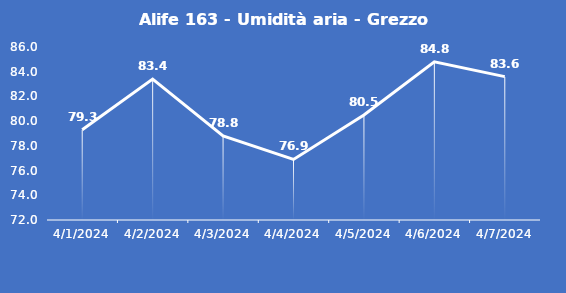
| Category | Alife 163 - Umidità aria - Grezzo (%) |
|---|---|
| 4/1/24 | 79.3 |
| 4/2/24 | 83.4 |
| 4/3/24 | 78.8 |
| 4/4/24 | 76.9 |
| 4/5/24 | 80.5 |
| 4/6/24 | 84.8 |
| 4/7/24 | 83.6 |